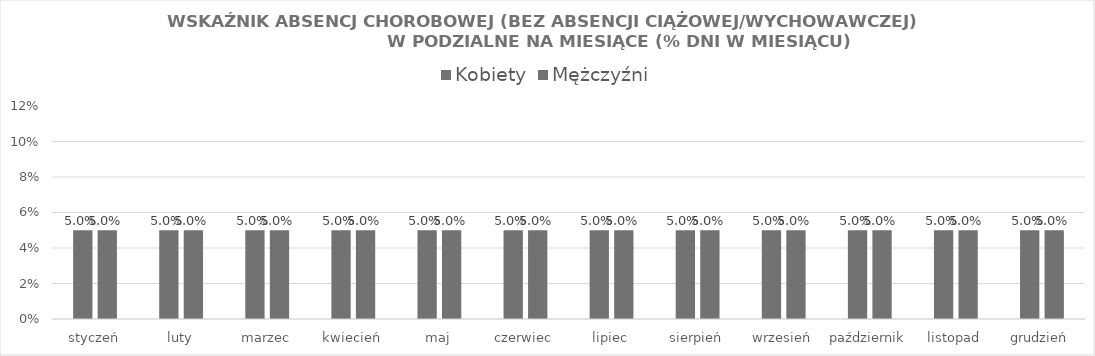
| Category | Kobiety | Mężczyźni |
|---|---|---|
| styczeń | 0.05 | 0.05 |
| luty | 0.05 | 0.05 |
| marzec | 0.05 | 0.05 |
| kwiecień | 0.05 | 0.05 |
| maj | 0.05 | 0.05 |
| czerwiec | 0.05 | 0.05 |
| lipiec | 0.05 | 0.05 |
| sierpień | 0.05 | 0.05 |
| wrzesień | 0.05 | 0.05 |
| październik | 0.05 | 0.05 |
| listopad | 0.05 | 0.05 |
| grudzień | 0.05 | 0.05 |